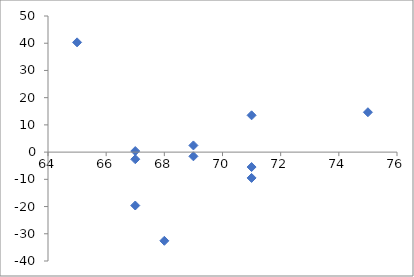
| Category | Series 0 |
|---|---|
| 65.0 | 40.319 |
| 67.0 | -19.615 |
| 71.0 | 13.518 |
| 71.0 | -5.482 |
| 68.0 | -32.582 |
| 75.0 | 14.65 |
| 67.0 | 0.385 |
| 69.0 | 2.452 |
| 71.0 | -9.482 |
| 67.0 | -2.615 |
| 69.0 | -1.548 |